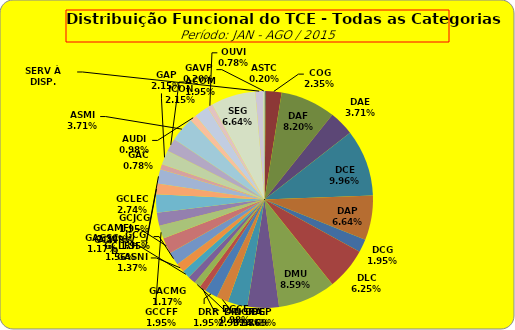
| Category | ASTC COG DAF DAE DCE DAP DCG DLC DMU DGP DIN DPE DRR DGCE DGPA GACMG GAGSC GASNI GCG GCAMFJ GCCFF GCJCG GCLEC GCLRH GCWRWD GAC GAP ACOM ASMI AUDI ICON OUVI SEG SERV À DISP. GAVP |
|---|---|
| ASTC | 1 |
| COG | 12 |
| DAF | 42 |
| DAE | 19 |
| DCE | 51 |
| DAP | 34 |
| DCG | 10 |
| DLC | 32 |
| DMU | 44 |
| DGP | 24 |
| DIN | 15 |
| DPE | 9 |
| DRR | 10 |
| DGCE | 5 |
| DGPA | 5 |
| GACMG | 6 |
| GAGSC | 6 |
| GASNI | 7 |
| GCG | 10 |
| GCAMFJ | 12 |
| GCCFF | 10 |
| GCJCG | 10 |
| GCLEC | 14 |
| GCLRH | 8 |
| GCWRWD | 11 |
| GAC | 4 |
| GAP | 11 |
| ACOM | 10 |
| ASMI | 19 |
| AUDI | 5 |
| ICON | 11 |
| OUVI | 4 |
| SEG | 34 |
| SERV À DISP. | 6 |
| GAVP | 1 |